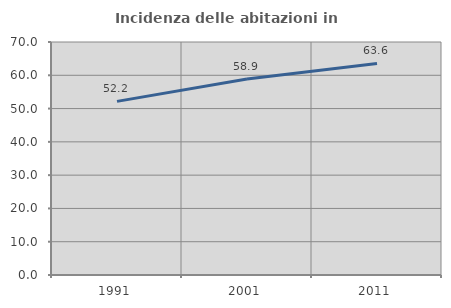
| Category | Incidenza delle abitazioni in proprietà  |
|---|---|
| 1991.0 | 52.162 |
| 2001.0 | 58.856 |
| 2011.0 | 63.561 |